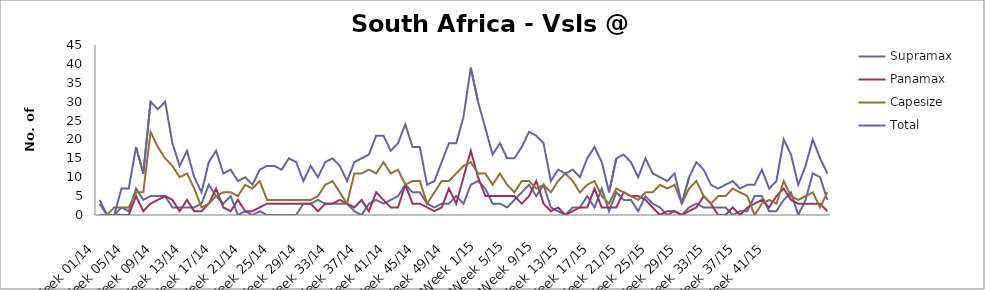
| Category | Supramax | Panamax | Capesize | Total |
|---|---|---|---|---|
| Week 01/14 | 3 | 0 | 0 | 4 |
| Week 02/14 | 0 | 0 | 0 | 0 |
| Week 03/14 | 0 | 0 | 2 | 0 |
| Week 04/14 | 2 | 0 | 2 | 7 |
| Week 05/14 | 1 | 0 | 2 | 7 |
| Week 06/14 | 7 | 5 | 6 | 18 |
| Week 07/14 | 4 | 1 | 6 | 11 |
| Week 08/14 | 5 | 3 | 22 | 30 |
| Week 09/14 | 5 | 4 | 18 | 28 |
| Week 10/14 | 5 | 5 | 15 | 30 |
| Week 11/14 | 2 | 4 | 13 | 19 |
| Week 12/14 | 2 | 1 | 10 | 13 |
| Week 13/14 | 2 | 4 | 11 | 17 |
| Week 14/14 | 2 | 1 | 7 | 10 |
| Week 15/14 | 3 | 1 | 2 | 6 |
| Week 16/14 | 8 | 3 | 3 | 14 |
| Week 17/14 | 5 | 7 | 5 | 17 |
| Week 18/14 | 3 | 2 | 6 | 11 |
| Week 19/14 | 5 | 1 | 6 | 12 |
| Week 20/14 | 0 | 4 | 5 | 9 |
| Week 21/14 | 1 | 1 | 8 | 10 |
| Week 22/14 | 0 | 1 | 7 | 8 |
| Week 23/14 | 1 | 2 | 9 | 12 |
| Week 24/14 | 0 | 3 | 4 | 13 |
| Week 25/14 | 0 | 3 | 4 | 13 |
| Week 26/14 | 0 | 3 | 4 | 12 |
| Week 27/14 | 0 | 3 | 4 | 15 |
| Week 28/14 | 0 | 3 | 4 | 14 |
| Week 29/14 | 3 | 3 | 4 | 9 |
| Week 30/14 | 3 | 3 | 4 | 13 |
| Week 31/14 | 4 | 1 | 5 | 10 |
| Week 32/14 | 3 | 3 | 8 | 14 |
| Week 33/14 | 3 | 3 | 9 | 15 |
| Week 34/14 | 3 | 4 | 6 | 13 |
| Week 35/14 | 3 | 3 | 3 | 9 |
| Week 36/14 | 1 | 2 | 11 | 14 |
| Week 37/14 | 0 | 4 | 11 | 15 |
| Week 38/14 | 3 | 1 | 12 | 16 |
| Week 39/14 | 4 | 6 | 11 | 21 |
| Week 40/14 | 3 | 4 | 14 | 21 |
| Week 41/14 | 4 | 2 | 11 | 17 |
| Week 42/14 | 5 | 2 | 12 | 19 |
| Week 43/14 | 8 | 8 | 8 | 24 |
| Week 44/14 | 6 | 3 | 9 | 18 |
| Week 45/14 | 6 | 3 | 9 | 18 |
| Week 46/14 | 3 | 2 | 3 | 8 |
| Week 47/14 | 2 | 1 | 6 | 9 |
| Week 48/14 | 3 | 2 | 9 | 14 |
| Week 49/14 | 3 | 7 | 9 | 19 |
| Week 50/14 | 5 | 3 | 11 | 19 |
| Week 51/14 | 3 | 10 | 13 | 26 |
| Week 52/14 | 8 | 17 | 14 | 39 |
| Week 1/15 | 9 | 10 | 11 | 30 |
| Week 2/15 | 7 | 5 | 11 | 23 |
| Week 3/15 | 3 | 5 | 8 | 16 |
| Week 4/15 | 3 | 5 | 11 | 19 |
| Week 5/15 | 2 | 5 | 8 | 15 |
| Week 6/15 | 4 | 5 | 6 | 15 |
| Week 7/15 | 6 | 3 | 9 | 18 |
| Week 8/15 | 8 | 5 | 9 | 22 |
| Week 9/15 | 5 | 9 | 7 | 21 |
| Week 10/15 | 8 | 3 | 8 | 19 |
| Week 11/15 | 2 | 1 | 6 | 9 |
| Week 12/15 | 1 | 2 | 9 | 12 |
| Week 13/15 | 0 | 0 | 11 | 11 |
| Week 14/15 | 2 | 1 | 9 | 12 |
| Week 15/15 | 2 | 2 | 6 | 10 |
| Week 16/15 | 5 | 2 | 8 | 15 |
| Week 17/15 | 2 | 7 | 9 | 18 |
| Week 18/15 | 7 | 2 | 5 | 14 |
| Week 19/15 | 1 | 2 | 3 | 6 |
| Week 20/15 | 6 | 2 | 7 | 15 |
| Week 21/15 | 4 | 6 | 6 | 16 |
| Week 22/15 | 4 | 5 | 5 | 14 |
| Week 23/15 | 1 | 5 | 4 | 10 |
| Week 24/15 | 5 | 4 | 6 | 15 |
| Week 25/15 | 3 | 2 | 6 | 11 |
| Week 26/15 | 2 | 0 | 8 | 10 |
| Week 27/15 | 0 | 1 | 7 | 9 |
| Week 28/15 | 1 | 1 | 8 | 11 |
| Week 29/15 | 0 | 0 | 3 | 3 |
| Week 30/15 | 2 | 1 | 7 | 10 |
| Week 31/15 | 3 | 2 | 9 | 14 |
| Week 32/15 | 2 | 5 | 5 | 12 |
| Week 33/15 | 2 | 3 | 3 | 8 |
| Week 34/15 | 2 | 0 | 5 | 7 |
| Week 35/15 | 2 | 0 | 5 | 8 |
| Week 36/15 | 0 | 2 | 7 | 9 |
| Week 37/15 | 1 | 0 | 6 | 7 |
| Week 38/15 | 1 | 2 | 5 | 8 |
| Week 39/15 | 5 | 3 | 0 | 8 |
| Week 40/15 | 5 | 4 | 3 | 12 |
| Week 41/15 | 1 | 2 | 4 | 7 |
| Week 42/15 | 1 | 5 | 3 | 9 |